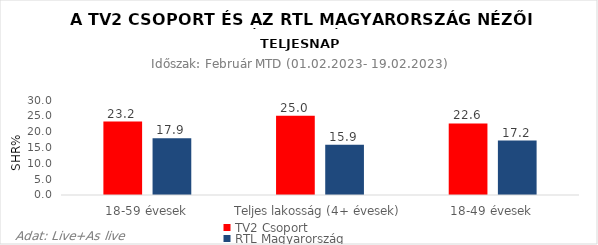
| Category | TV2 Csoport | RTL Magyarország |
|---|---|---|
| 18-59 évesek | 23.2 | 17.9 |
| Teljes lakosság (4+ évesek) | 25 | 15.9 |
| 18-49 évesek | 22.6 | 17.2 |